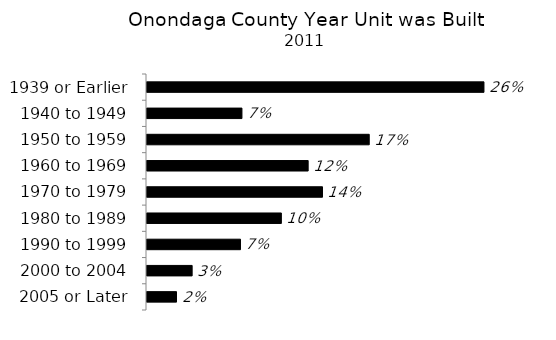
| Category | Series 0 |
|---|---|
| 2005 or Later | 0.023 |
| 2000 to 2004 | 0.035 |
| 1990 to 1999 | 0.072 |
| 1980 to 1989 | 0.104 |
| 1970 to 1979 | 0.136 |
| 1960 to 1969 | 0.125 |
| 1950 to 1959 | 0.172 |
| 1940 to 1949 | 0.073 |
| 1939 or Earlier | 0.261 |